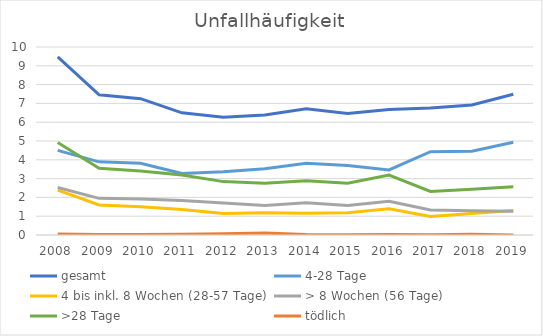
| Category | gesamt | 4-28 Tage | 4 bis inkl. 8 Wochen (28-57 Tage) | > 8 Wochen (56 Tage) | >28 Tage | tödlich |
|---|---|---|---|---|---|---|
| 2008.0 | 9.47 | 4.5 | 2.39 | 2.53 | 4.92 | 0.05 |
| 2009.0 | 7.46 | 3.89 | 1.6 | 1.95 | 3.55 | 0.02 |
| 2010.0 | 7.25 | 3.82 | 1.5 | 1.91 | 3.41 | 0.02 |
| 2011.0 | 6.5 | 3.27 | 1.36 | 1.83 | 3.19 | 0.04 |
| 2012.0 | 6.27 | 3.36 | 1.14 | 1.7 | 2.84 | 0.07 |
| 2013.0 | 6.38 | 3.53 | 1.18 | 1.57 | 2.75 | 0.1 |
| 2014.0 | 6.72 | 3.82 | 1.16 | 1.72 | 2.88 | 0.02 |
| 2015.0 | 6.46 | 3.7 | 1.18 | 1.57 | 2.75 | 0.01 |
| 2016.0 | 6.68 | 3.46 | 1.4 | 1.79 | 3.19 | 0.03 |
| 2017.0 | 6.76 | 4.43 | 0.99 | 1.33 | 2.32 | 0.01 |
| 2018.0 | 6.92 | 4.45 | 1.14 | 1.29 | 2.43 | 0.04 |
| 2019.0 | 7.49 | 4.93 | 1.3 | 1.26 | 2.56 | 0 |